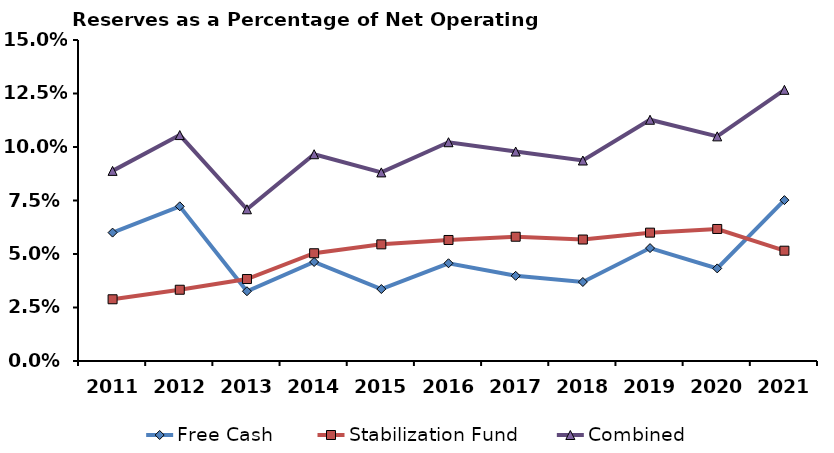
| Category | Free Cash  | Stabilization Fund | Combined |
|---|---|---|---|
| 2011.0 | 0.06 | 0.029 | 0.089 |
| 2012.0 | 0.072 | 0.033 | 0.106 |
| 2013.0 | 0.033 | 0.038 | 0.071 |
| 2014.0 | 0.046 | 0.05 | 0.097 |
| 2015.0 | 0.034 | 0.055 | 0.088 |
| 2016.0 | 0.046 | 0.057 | 0.102 |
| 2017.0 | 0.04 | 0.058 | 0.098 |
| 2018.0 | 0.037 | 0.057 | 0.094 |
| 2019.0 | 0.053 | 0.06 | 0.113 |
| 2020.0 | 0.043 | 0.062 | 0.105 |
| 2021.0 | 0.075 | 0.052 | 0.127 |